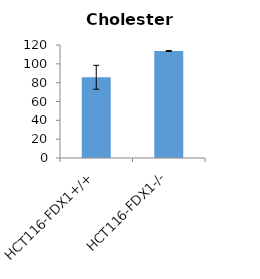
| Category | Cholesterol |
|---|---|
| HCT116-FDX1+/+ | 85.752 |
| HCT116-FDX1-/- | 113.576 |